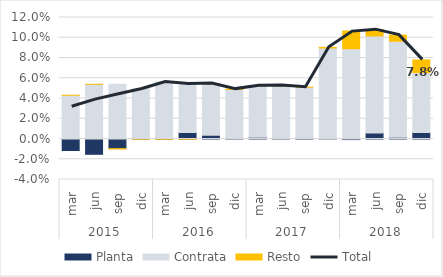
| Category | Planta | Contrata | Resto |
|---|---|---|---|
| 0 | -0.011 | 0.043 | 0 |
| 1 | -0.015 | 0.054 | 0 |
| 2 | -0.01 | 0.054 | 0 |
| 3 | 0 | 0.049 | 0 |
| 4 | 0.001 | 0.055 | 0 |
| 5 | 0.006 | 0.048 | 0 |
| 6 | 0.004 | 0.051 | 0 |
| 7 | 0 | 0.049 | 0 |
| 8 | 0.002 | 0.051 | 0 |
| 9 | 0 | 0.052 | 0 |
| 10 | 0.001 | 0.05 | 0 |
| 11 | 0 | 0.09 | 0.001 |
| 12 | -0.001 | 0.089 | 0.017 |
| 13 | 0.006 | 0.096 | 0.006 |
| 14 | 0.002 | 0.095 | 0.006 |
| 15 | 0.006 | 0.059 | 0.012 |